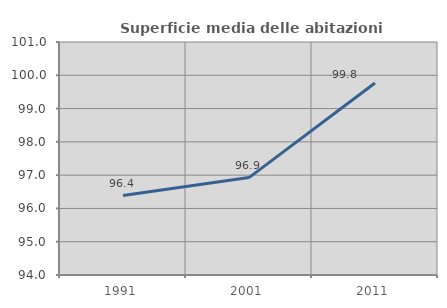
| Category | Superficie media delle abitazioni occupate |
|---|---|
| 1991.0 | 96.386 |
| 2001.0 | 96.926 |
| 2011.0 | 99.769 |